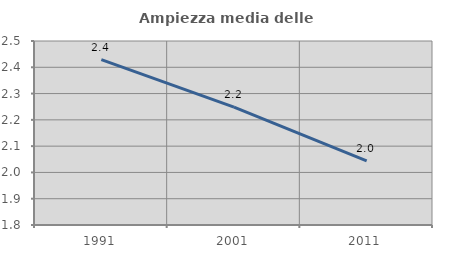
| Category | Ampiezza media delle famiglie |
|---|---|
| 1991.0 | 2.429 |
| 2001.0 | 2.249 |
| 2011.0 | 2.044 |